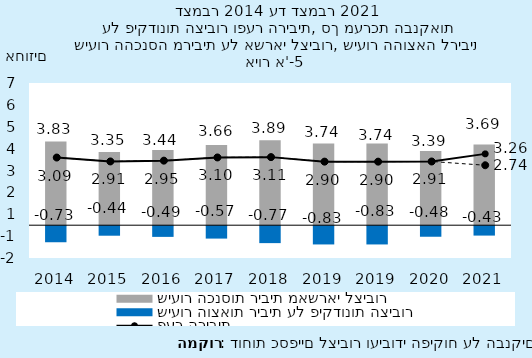
| Category | שיעור הכנסות ריבית מאשראי לציבור | שיעור הוצאות ריבית על פיקדונות הציבור |
|---|---|---|
| 2014.0 | 3.826 | -0.734 |
| 2015.0 | 3.35 | -0.435 |
| 2016.0 | 3.439 | -0.489 |
| 2017.0 | 3.664 | -0.567 |
| 2018.0 | 3.886 | -0.774 |
| 2019.0 | 3.739 | -0.835 |
| 2019.0 | 3.739 | -0.835 |
| 2020.0 | 3.394 | -0.483 |
| 2021.0 | 3.689 | -0.43 |